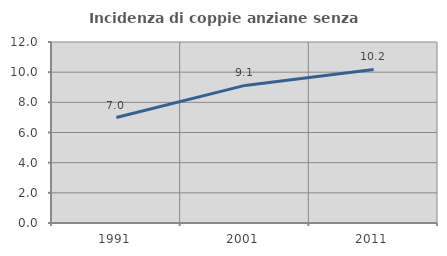
| Category | Incidenza di coppie anziane senza figli  |
|---|---|
| 1991.0 | 6.989 |
| 2001.0 | 9.122 |
| 2011.0 | 10.18 |